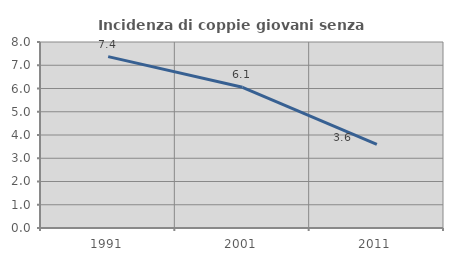
| Category | Incidenza di coppie giovani senza figli |
|---|---|
| 1991.0 | 7.372 |
| 2001.0 | 6.051 |
| 2011.0 | 3.595 |